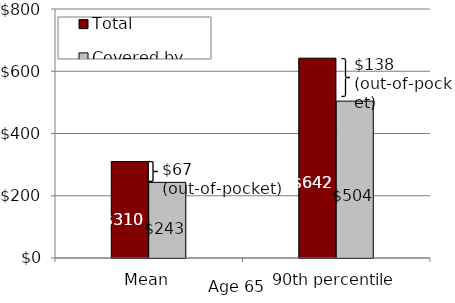
| Category | Total | Covered by insurance |
|---|---|---|
| Mean | 310 | 243 |
| 90th percentile | 642 | 504 |